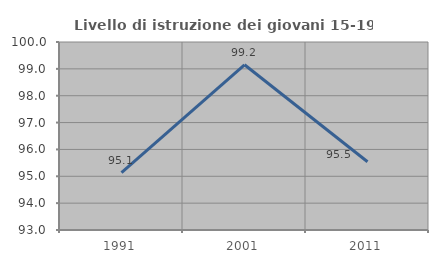
| Category | Livello di istruzione dei giovani 15-19 anni |
|---|---|
| 1991.0 | 95.135 |
| 2001.0 | 99.153 |
| 2011.0 | 95.541 |